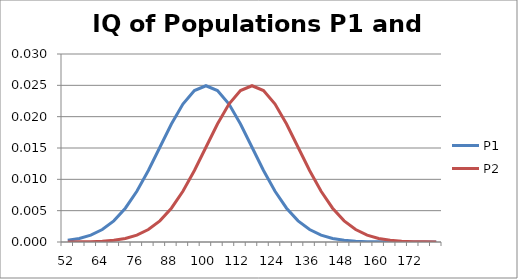
| Category | P1 | P2 |
|---|---|---|
| 52.0 | 0 | 0 |
| 56.0 | 0.001 | 0 |
| 60.0 | 0.001 | 0 |
| 64.0 | 0.002 | 0 |
| 68.0 | 0.003 | 0 |
| 72.0 | 0.005 | 0.001 |
| 76.0 | 0.008 | 0.001 |
| 80.0 | 0.011 | 0.002 |
| 84.0 | 0.015 | 0.003 |
| 88.0 | 0.019 | 0.005 |
| 92.0 | 0.022 | 0.008 |
| 96.0 | 0.024 | 0.011 |
| 100.0 | 0.025 | 0.015 |
| 104.0 | 0.024 | 0.019 |
| 108.0 | 0.022 | 0.022 |
| 112.0 | 0.019 | 0.024 |
| 116.0 | 0.015 | 0.025 |
| 120.0 | 0.011 | 0.024 |
| 124.0 | 0.008 | 0.022 |
| 128.0 | 0.005 | 0.019 |
| 132.0 | 0.003 | 0.015 |
| 136.0 | 0.002 | 0.011 |
| 140.0 | 0.001 | 0.008 |
| 144.0 | 0.001 | 0.005 |
| 148.0 | 0 | 0.003 |
| 152.0 | 0 | 0.002 |
| 156.0 | 0 | 0.001 |
| 160.0 | 0 | 0.001 |
| 164.0 | 0 | 0 |
| 168.0 | 0 | 0 |
| 172.0 | 0 | 0 |
| 176.0 | 0 | 0 |
| 180.0 | 0 | 0 |